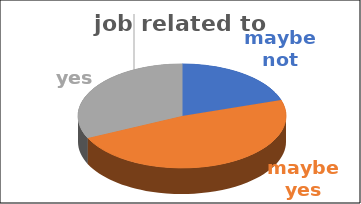
| Category | job related to studies | Series 1 | Series 2 | Series 3 | Series 4 |
|---|---|---|---|---|---|
| maybe not | 0.2 |  |  |  |  |
| maybe yes | 0.48 |  |  |  |  |
| yes | 0.32 |  |  |  |  |